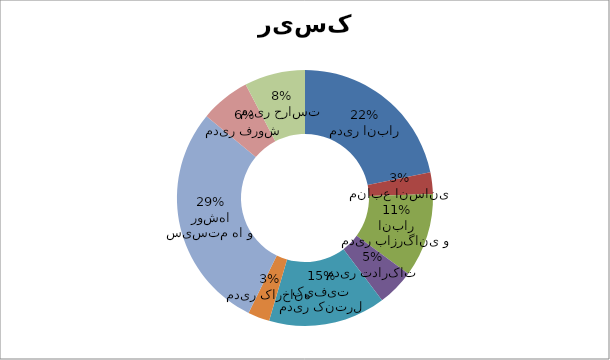
| Category | سطح ریسک |
|---|---|
| مدیر انبار | 0.119 |
| منابع انسانی | 0.015 |
| مدیر بازرگانی و انبار | 0.058 |
| مدیر تدارکات | 0.026 |
| مدیر کنترل کیفیت | 0.081 |
| مدیر کارخانه | 0.015 |
| سیستم ها و روشها | 0.157 |
| مدیر فروش | 0.034 |
| مدیر حراست | 0.042 |